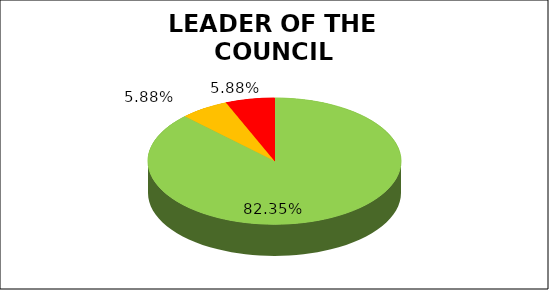
| Category | Q4 |
|---|---|
| Green | 0.824 |
| Amber | 0.059 |
| Red | 0.059 |